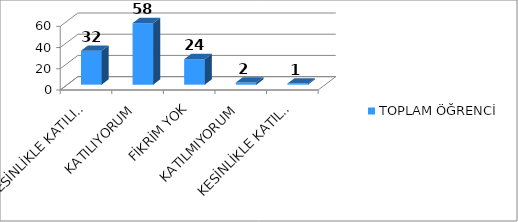
| Category | TOPLAM ÖĞRENCİ |
|---|---|
| KESİNLİKLE KATILIYORUM | 32 |
| KATILIYORUM | 58 |
| FİKRİM YOK | 24 |
| KATILMIYORUM | 2 |
| KESİNLİKLE KATILMIYORUM | 1 |